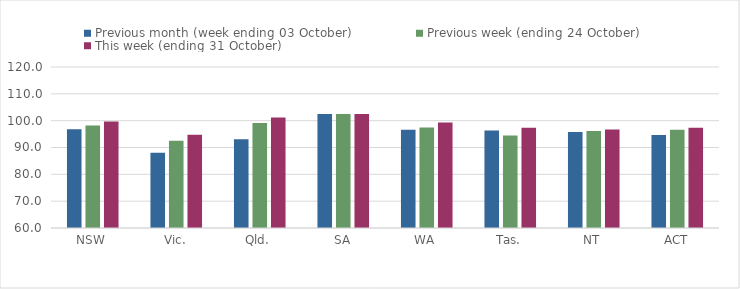
| Category | Previous month (week ending 03 October) | Previous week (ending 24 October) | This week (ending 31 October) |
|---|---|---|---|
| NSW | 96.78 | 98.18 | 99.71 |
| Vic. | 88.09 | 92.51 | 94.76 |
| Qld. | 93.1 | 99.12 | 101.15 |
| SA | 102.49 | 102.49 | 102.49 |
| WA | 96.64 | 97.44 | 99.34 |
| Tas. | 96.33 | 94.51 | 97.35 |
| NT | 95.74 | 96.13 | 96.74 |
| ACT | 94.67 | 96.64 | 97.34 |